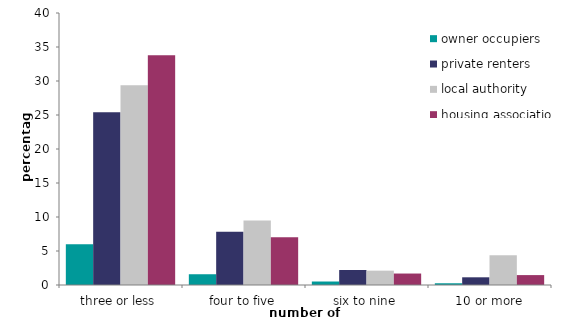
| Category | owner occupiers | private renters | local authority | housing association |
|---|---|---|---|---|
| three or less | 5.987 | 25.419 | 29.39 | 33.79 |
| four to five | 1.582 | 7.822 | 9.474 | 7.015 |
| six to nine | 0.513 | 2.202 | 2.112 | 1.686 |
| 10 or more | 0.254 | 1.132 | 4.374 | 1.457 |